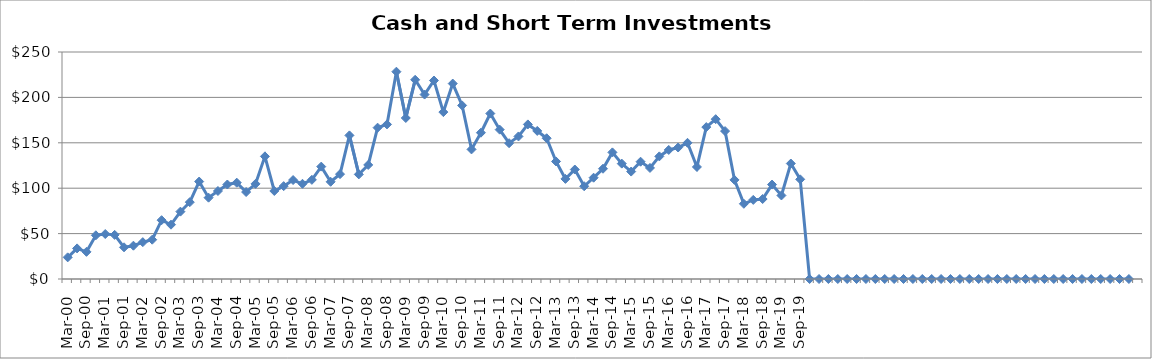
| Category | Cash and Short-Term Investments ($Millions) |
|---|---|
| Mar-00 | 23.842 |
| Jun-00 | 33.706 |
| Sep-00 | 29.906 |
| Dec-00 | 48.132 |
| Mar-01 | 49.539 |
| Jun-01 | 48.605 |
| Sep-01 | 34.901 |
| Dec-01 | 36.673 |
| Mar-02 | 40.584 |
| Jun-02 | 43.291 |
| Sep-02 | 64.788 |
| Dec-02 | 59.826 |
| Mar-03 | 74.191 |
| Jun-03 | 84.6 |
| Sep-03 | 107.3 |
| Dec-03 | 89.552 |
| Mar-04 | 96.928 |
| Jun-04 | 104.069 |
| Sep-04 | 106.088 |
| Dec-04 | 95.768 |
| Mar-05 | 104.777 |
| Jun-05 | 135.037 |
| Sep-05 | 96.934 |
| Dec-05 | 102.296 |
| Mar-06 | 108.97 |
| Jun-06 | 104.875 |
| Sep-06 | 109.2 |
| Dec-06 | 123.768 |
| Mar-07 | 107.067 |
| Jun-07 | 115.488 |
| Sep-07 | 158.15 |
| Dec-07 | 115.195 |
| Mar-08 | 125.606 |
| Jun-08 | 166.668 |
| Sep-08 | 170.26 |
| Dec-08 | 228.308 |
| Mar-09 | 177.347 |
| Jun-09 | 219.4 |
| Sep-09 | 203.138 |
| Dec-09 | 218.597 |
| Mar-10 | 183.829 |
| Jun-10 | 215.249 |
| Sep-10 | 191.176 |
| Dec-10 | 142.729 |
| Mar-11 | 161.11 |
| Jun-11 | 182.225 |
| Sep-11 | 164.479 |
| Dec-11 | 149.57 |
| Mar-12 | 157 |
| Jun-12 | 170.252 |
| Sep-12 | 163.055 |
| Dec-12 | 155 |
| Mar-13 | 129.452 |
| Jun-13 | 110.248 |
| Sep-13 | 120.563 |
| Dec-13 | 102.16 |
| Mar-14 | 111.564 |
| Jun-14 | 121.431 |
| Sep-14 | 139.451 |
| Dec-14 | 127.051 |
| Mar-15 | 118.321 |
| Jun-15 | 129.176 |
| Sep-15 | 122.3 |
| Dec-15 | 135.034 |
| Mar-16 | 142.108 |
| Jun-16 | 144.84 |
| Sep-16 | 149.976 |
| Dec-16 | 123.406 |
| Mar-17 | 167.312 |
| Jun-17 | 176.012 |
| Sep-17 | 162.894 |
| Dec-17 | 109.148 |
| Mar-18 | 82.824 |
| Jun-18 | 87.118 |
| Sep-18 | 88.082 |
| Dec-18 | 104 |
| Mar-19 | 92 |
| Jun-19 | 127.184 |
| Sep-19 | 109.767 |